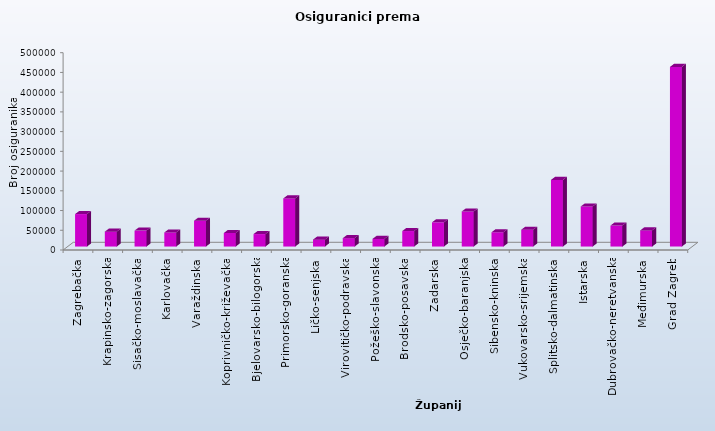
| Category | Series 0 |
|---|---|
| Zagrebačka | 82282 |
| Krapinsko-zagorska | 37732 |
| Sisačko-moslavačka | 40387 |
| Karlovačka | 35679 |
| Varaždinska | 65447 |
| Koprivničko-križevačka | 34272 |
| Bjelovarsko-bilogorska | 31599 |
| Primorsko-goranska | 121891 |
| Ličko-senjska | 17501 |
| Virovitičko-podravska | 21243 |
| Požeško-slavonska | 19363 |
| Brodsko-posavska | 39291 |
| Zadarska | 61379 |
| Osječko-baranjska | 88862 |
| Šibensko-kninska | 36198 |
| Vukovarsko-srijemska | 42607 |
| Splitsko-dalmatinska | 168881 |
| Istarska | 101505 |
| Dubrovačko-neretvanska | 53162 |
| Međimurska | 40927 |
| Grad Zagreb | 455238 |